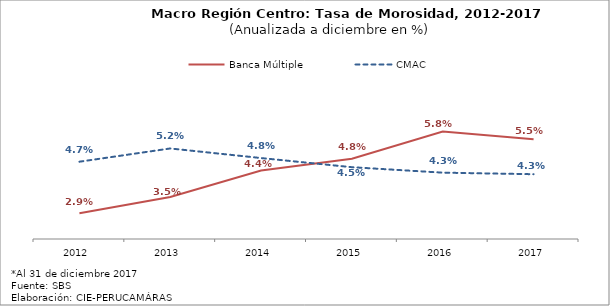
| Category | Banca Múltiple | CMAC |
|---|---|---|
| 2012.0 | 0.029 | 0.047 |
| 2013.0 | 0.035 | 0.052 |
| 2014.0 | 0.044 | 0.048 |
| 2015.0 | 0.048 | 0.045 |
| 2016.0 | 0.058 | 0.043 |
| 2017.0 | 0.055 | 0.043 |